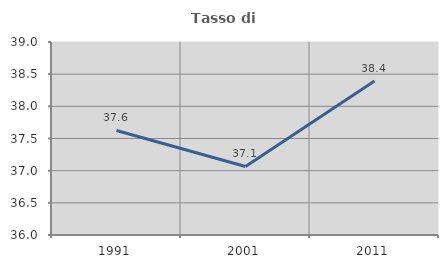
| Category | Tasso di occupazione   |
|---|---|
| 1991.0 | 37.625 |
| 2001.0 | 37.066 |
| 2011.0 | 38.392 |